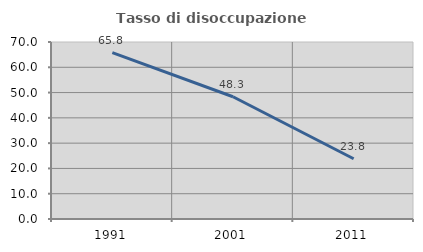
| Category | Tasso di disoccupazione giovanile  |
|---|---|
| 1991.0 | 65.828 |
| 2001.0 | 48.341 |
| 2011.0 | 23.837 |